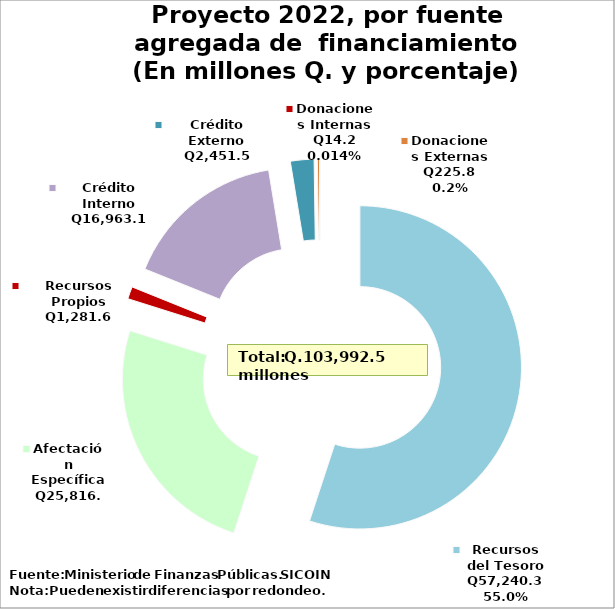
| Category | Recomendado 2018 |
|---|---|
| Recursos del Tesoro | 57240.3 |
| Afectación Específica | 25816 |
| Recursos Propios | 1281.6 |
| Crédito Interno | 16963.1 |
| Crédito Externo | 2451.5 |
| Donaciones Externas | 225.8 |
| Donaciones Internas | 14.2 |